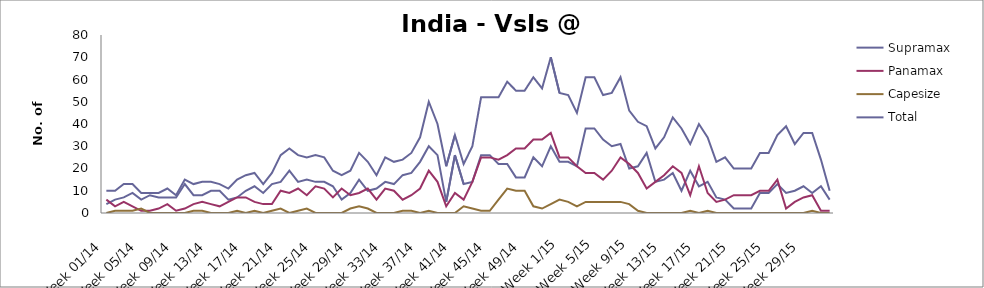
| Category | Supramax | Panamax | Capesize | Total |
|---|---|---|---|---|
| Week 01/14 | 4 | 6 | 0 | 10 |
| Week 02/14 | 6 | 3 | 1 | 10 |
| Week 03/14 | 7 | 5 | 1 | 13 |
| Week 04/14 | 9 | 3 | 1 | 13 |
| Week 05/14 | 6 | 1 | 2 | 9 |
| Week 06/14 | 8 | 1 | 0 | 9 |
| Week 07/14 | 7 | 2 | 0 | 9 |
| Week 08/14 | 7 | 4 | 0 | 11 |
| Week 09/14 | 7 | 1 | 0 | 8 |
| Week 10/14 | 13 | 2 | 0 | 15 |
| Week 11/14 | 8 | 4 | 1 | 13 |
| Week 12/14 | 8 | 5 | 1 | 14 |
| Week 13/14 | 10 | 4 | 0 | 14 |
| Week 14/14 | 10 | 3 | 0 | 13 |
| Week 15/14 | 6 | 5 | 0 | 11 |
| Week 16/14 | 7 | 7 | 1 | 15 |
| Week 17/14 | 10 | 7 | 0 | 17 |
| Week 18/14 | 12 | 5 | 1 | 18 |
| Week 19/14 | 9 | 4 | 0 | 13 |
| Week 20/14 | 13 | 4 | 1 | 18 |
| Week 21/14 | 14 | 10 | 2 | 26 |
| Week 22/14 | 19 | 9 | 0 | 29 |
| Week 23/14 | 14 | 11 | 1 | 26 |
| Week 24/14 | 15 | 8 | 2 | 25 |
| Week 25/14 | 14 | 12 | 0 | 26 |
| Week 26/14 | 14 | 11 | 0 | 25 |
| Week 27/14 | 12 | 7 | 0 | 19 |
| Week 28/14 | 6 | 11 | 0 | 17 |
| Week 29/14 | 9 | 8 | 2 | 19 |
| Week 30/14 | 15 | 9 | 3 | 27 |
| Week 31/14 | 10 | 11 | 2 | 23 |
| Week 32/14 | 11 | 6 | 0 | 17 |
| Week 33/14 | 14 | 11 | 0 | 25 |
| Week 34/14 | 13 | 10 | 0 | 23 |
| Week 35/14 | 17 | 6 | 1 | 24 |
| Week 36/14 | 18 | 8 | 1 | 27 |
| Week 37/14 | 23 | 11 | 0 | 34 |
| Week 38/14 | 30 | 19 | 1 | 50 |
| Week 39/14 | 26 | 14 | 0 | 40 |
| Week 40/14 | 5 | 3 | 0 | 21 |
| Week 41/14 | 26 | 9 | 0 | 35 |
| Week 42/14 | 13 | 6 | 3 | 22 |
| Week 43/14 | 14 | 14 | 2 | 30 |
| Week 44/14 | 26 | 25 | 1 | 52 |
| Week 45/14 | 26 | 25 | 1 | 52 |
| Week 46/14 | 22 | 24 | 6 | 52 |
| Week 47/14 | 22 | 26 | 11 | 59 |
| Week 48/14 | 16 | 29 | 10 | 55 |
| Week 49/14 | 16 | 29 | 10 | 55 |
| Week 50/14 | 25 | 33 | 3 | 61 |
| Week 51/14 | 21 | 33 | 2 | 56 |
| Week 52/14 | 30 | 36 | 4 | 70 |
| Week 1/15 | 23 | 25 | 6 | 54 |
| Week 2/15 | 23 | 25 | 5 | 53 |
| Week 3/15 | 21 | 21 | 3 | 45 |
| Week 4/15 | 38 | 18 | 5 | 61 |
| Week 5/15 | 38 | 18 | 5 | 61 |
| Week 6/15 | 33 | 15 | 5 | 53 |
| Week 7/15 | 30 | 19 | 5 | 54 |
| Week 8/15 | 31 | 25 | 5 | 61 |
| Week 9/15 | 20 | 22 | 4 | 46 |
| Week 10/15 | 21 | 18 | 1 | 41 |
| Week 11/15 | 27 | 11 | 0 | 39 |
| Week 12/15 | 14 | 14 | 0 | 29 |
| Week 13/15 | 15 | 17 | 0 | 34 |
| Week 14/15 | 18 | 21 | 0 | 43 |
| Week 15/15 | 10 | 18 | 0 | 38 |
| Week 16/15 | 19 | 8 | 1 | 31 |
| Week 17/15 | 12 | 21 | 0 | 40 |
| Week 18/15 | 14 | 9 | 1 | 34 |
| Week 19/15 | 7 | 5 | 0 | 23 |
| Week 20/15 | 6 | 6 | 0 | 25 |
| Week 21/15 | 2 | 8 | 0 | 20 |
| Week 22/15 | 2 | 8 | 0 | 20 |
| Week 23/15 | 2 | 8 | 0 | 20 |
| Week 24/15 | 9 | 10 | 0 | 27 |
| Week 25/15 | 9 | 10 | 0 | 27 |
| Week 26/15 | 13 | 15 | 0 | 35 |
| Week 27/15 | 9 | 2 | 0 | 39 |
| Week 28/15 | 10 | 5 | 0 | 31 |
| Week 29/15 | 12 | 7 | 0 | 36 |
| Week 30/15 | 9 | 8 | 1 | 36 |
| Week 31/15 | 12 | 1 | 0 | 24 |